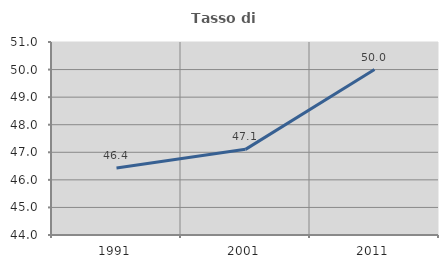
| Category | Tasso di occupazione   |
|---|---|
| 1991.0 | 46.429 |
| 2001.0 | 47.106 |
| 2011.0 | 50 |